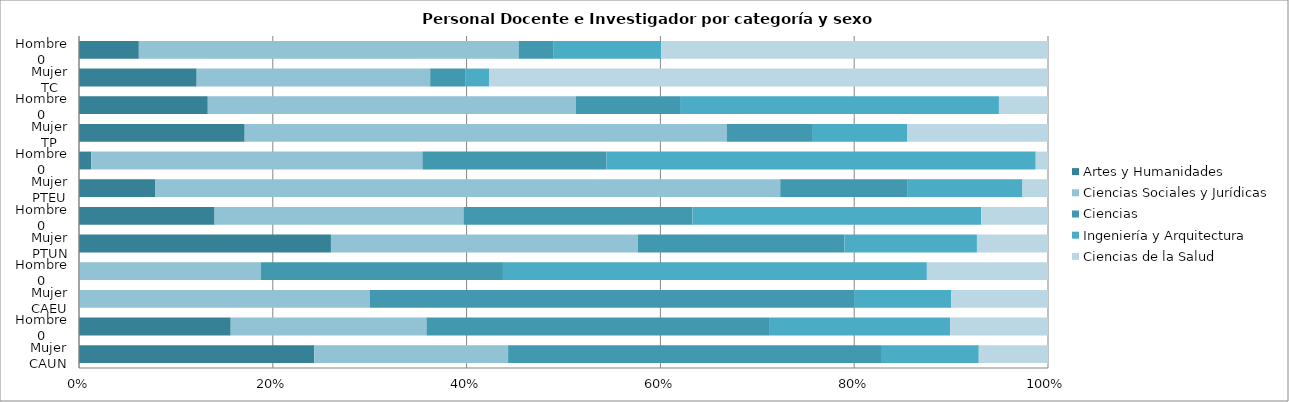
| Category | Artes y Humanidades | Ciencias Sociales y Jurídicas | Ciencias | Ingeniería y Arquitectura | Ciencias de la Salud |
|---|---|---|---|---|---|
| 0 | 17 | 14 | 27 | 7 | 5 |
| 1 | 31 | 40 | 70 | 37 | 20 |
| 2 | 0 | 3 | 5 | 1 | 1 |
| 3 | 0 | 3 | 4 | 7 | 2 |
| 4 | 78 | 95 | 64 | 41 | 22 |
| 5 | 61 | 112 | 103 | 130 | 30 |
| 6 | 6 | 49 | 10 | 9 | 2 |
| 7 | 1 | 27 | 15 | 35 | 1 |
| 8 | 33 | 96 | 17 | 19 | 28 |
| 9 | 21 | 60 | 17 | 52 | 8 |
| 10 | 64 | 127 | 19 | 13 | 304 |
| 11 | 26 | 165 | 15 | 47 | 168 |